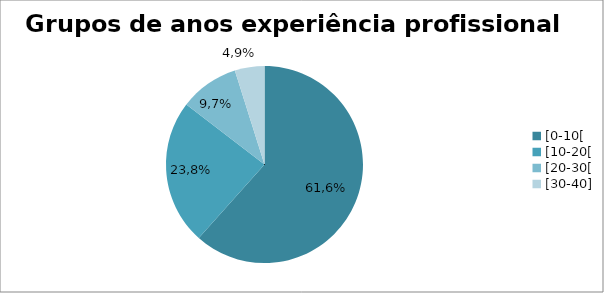
| Category | grupos de anos experiencia profissional |
|---|---|
| [0-10[ | 61.622 |
| [10-20[ | 23.784 |
| [20-30[ | 9.73 |
| [30-40] | 4.865 |